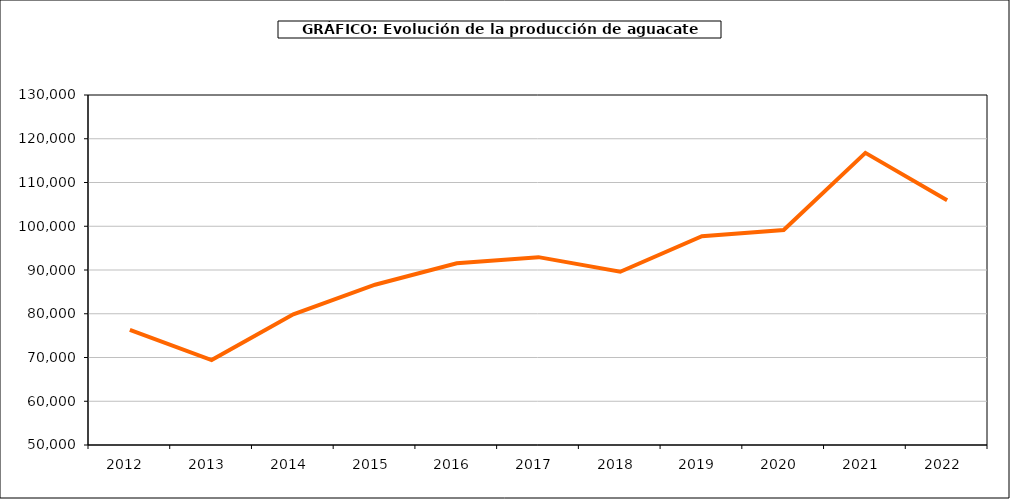
| Category | producción aguacate |
|---|---|
| 2012.0 | 76337 |
| 2013.0 | 69427 |
| 2014.0 | 79886 |
| 2015.0 | 86636 |
| 2016.0 | 91530 |
| 2017.0 | 92936 |
| 2018.0 | 89592 |
| 2019.0 | 97727 |
| 2020.0 | 99125 |
| 2021.0 | 116769 |
| 2022.0 | 105947 |